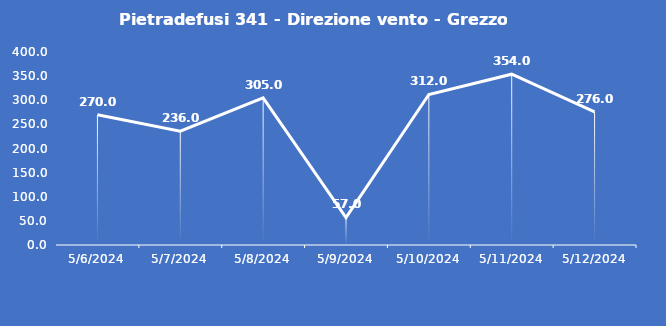
| Category | Pietradefusi 341 - Direzione vento - Grezzo (°N) |
|---|---|
| 5/6/24 | 270 |
| 5/7/24 | 236 |
| 5/8/24 | 305 |
| 5/9/24 | 57 |
| 5/10/24 | 312 |
| 5/11/24 | 354 |
| 5/12/24 | 276 |